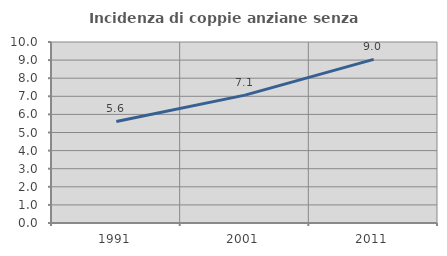
| Category | Incidenza di coppie anziane senza figli  |
|---|---|
| 1991.0 | 5.61 |
| 2001.0 | 7.066 |
| 2011.0 | 9.041 |